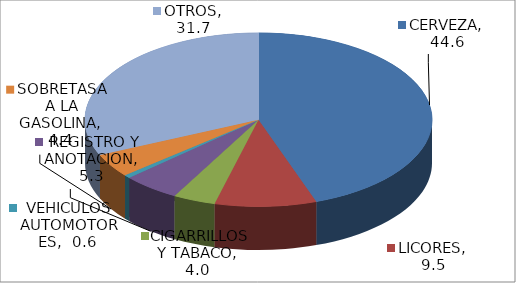
| Category | Series 0 |
|---|---|
| CERVEZA | 44.607 |
| LICORES | 9.451 |
| CIGARRILLOS Y TABACO | 3.961 |
| REGISTRO Y ANOTACION | 5.326 |
| VEHICULOS AUTOMOTORES | 0.612 |
| SOBRETASA A LA GASOLINA | 4.378 |
| OTROS | 31.664 |